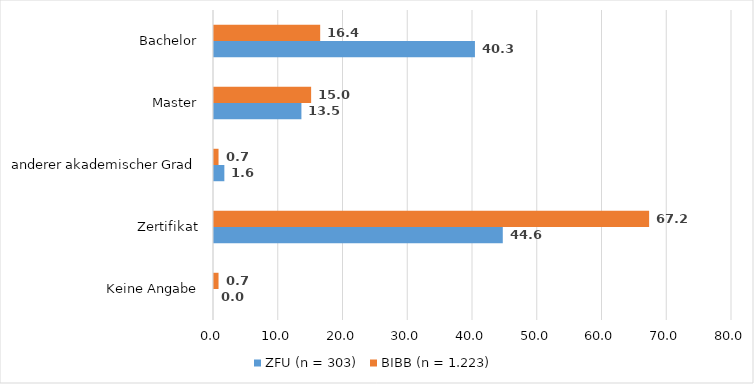
| Category | ZFU (n = 303) | BIBB (n = 1.223) |
|---|---|---|
| Keine Angabe | 0 | 0.7 |
| Zertifikat | 44.6 | 67.2 |
| anderer akademischer Grad | 1.6 | 0.7 |
| Master | 13.5 | 15 |
| Bachelor | 40.3 | 16.4 |